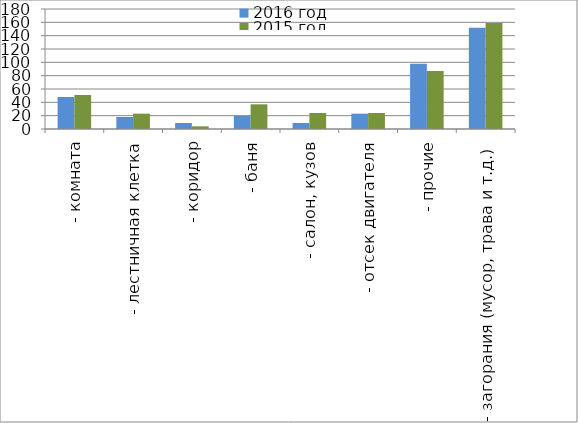
| Category | 2016 год | 2015 год |
|---|---|---|
|  - комната | 48 | 51 |
|  - лестничная клетка | 18 | 23 |
|  - коридор | 9 | 4 |
|  - баня | 20 | 37 |
|  - салон, кузов | 9 | 24 |
|  - отсек двигателя | 23 | 24 |
| - прочие | 98 | 87 |
| - загорания (мусор, трава и т.д.)  | 152 | 159 |